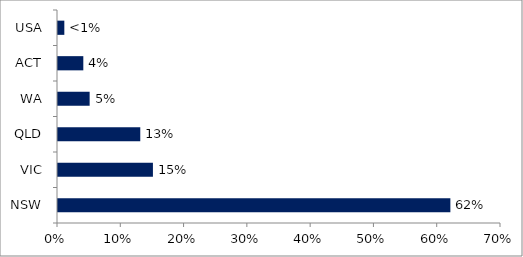
| Category | Series 0 |
|---|---|
| NSW | 0.62 |
| VIC | 0.15 |
| QLD | 0.13 |
| WA | 0.05 |
| ACT | 0.04 |
| USA | 0.01 |